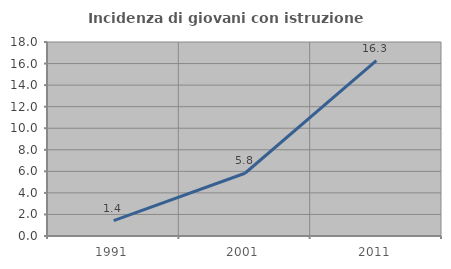
| Category | Incidenza di giovani con istruzione universitaria |
|---|---|
| 1991.0 | 1.429 |
| 2001.0 | 5.822 |
| 2011.0 | 16.279 |